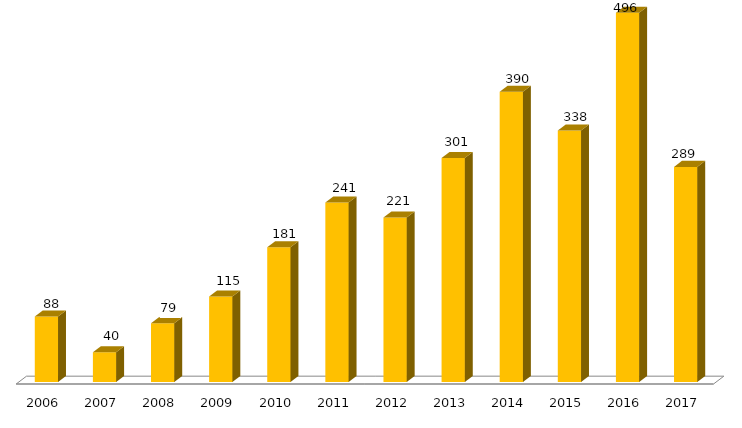
| Category | TOTAL |
|---|---|
| 2006.0 | 88 |
| 2007.0 | 40 |
| 2008.0 | 79 |
| 2009.0 | 115 |
| 2010.0 | 181 |
| 2011.0 | 241 |
| 2012.0 | 221 |
| 2013.0 | 301 |
| 2014.0 | 390 |
| 2015.0 | 338 |
| 2016.0 | 496 |
| 2017.0 | 289 |